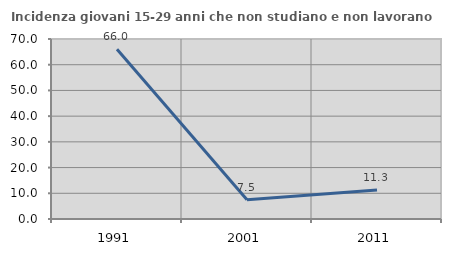
| Category | Incidenza giovani 15-29 anni che non studiano e non lavorano  |
|---|---|
| 1991.0 | 65.999 |
| 2001.0 | 7.469 |
| 2011.0 | 11.275 |